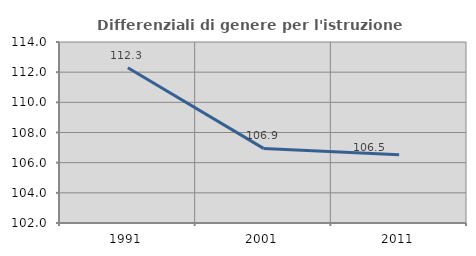
| Category | Differenziali di genere per l'istruzione superiore |
|---|---|
| 1991.0 | 112.29 |
| 2001.0 | 106.945 |
| 2011.0 | 106.523 |